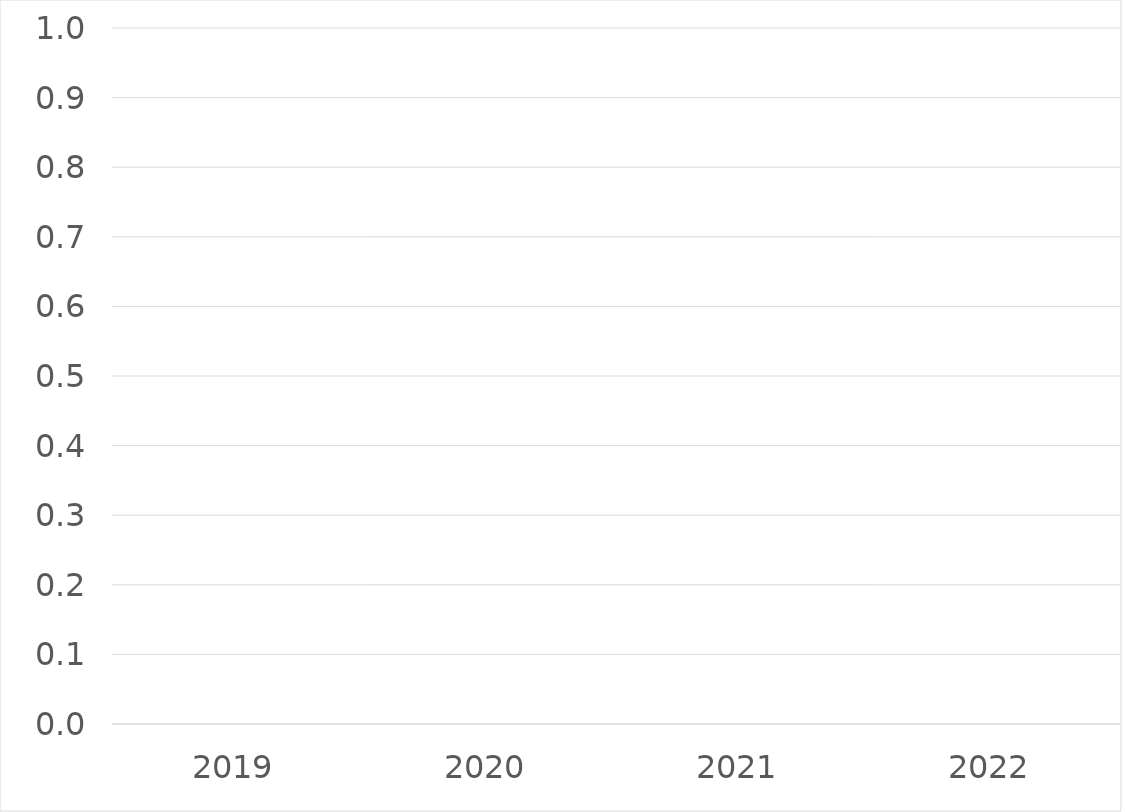
| Category | Series 0 |
|---|---|
| 2019 | 0 |
| 2020 | 0 |
| 2021 | 0 |
| 2022 | 0 |